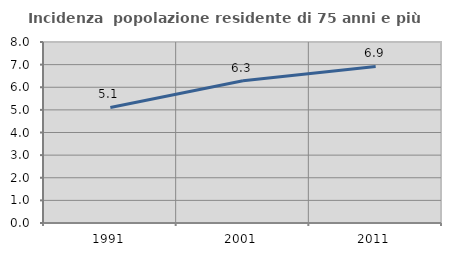
| Category | Incidenza  popolazione residente di 75 anni e più |
|---|---|
| 1991.0 | 5.107 |
| 2001.0 | 6.289 |
| 2011.0 | 6.917 |